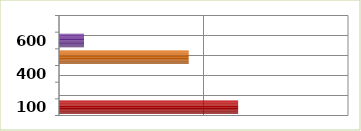
| Category | Series 0 |
|---|---|
| 100.0 | 1239649612 |
| 200.0 | 0 |
| 400.0 | 0 |
| 500.0 | 897412825 |
| 600.0 | 173051628 |
| 700.0 | 0 |